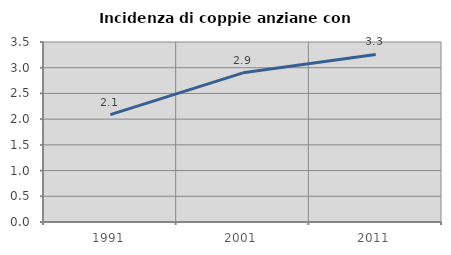
| Category | Incidenza di coppie anziane con figli |
|---|---|
| 1991.0 | 2.087 |
| 2001.0 | 2.9 |
| 2011.0 | 3.257 |